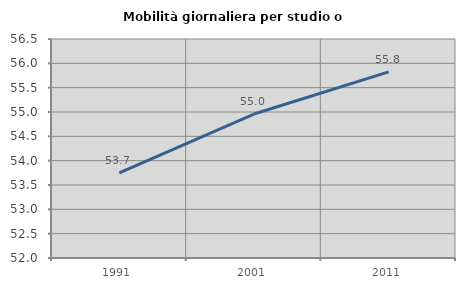
| Category | Mobilità giornaliera per studio o lavoro |
|---|---|
| 1991.0 | 53.749 |
| 2001.0 | 54.959 |
| 2011.0 | 55.824 |